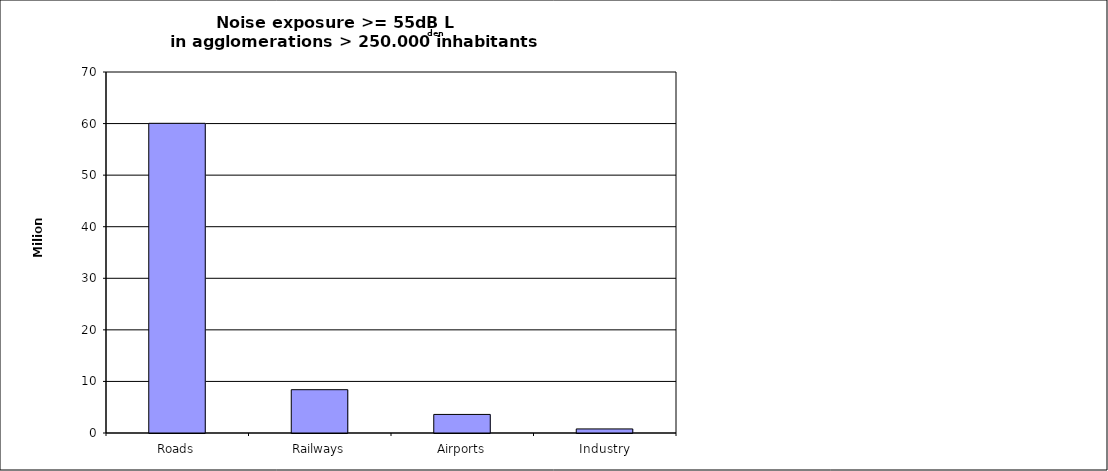
| Category | Series 0 |
|---|---|
| Roads | 60051830 |
| Railways | 8395900 |
| Airports | 3601100 |
| Industry | 790500 |